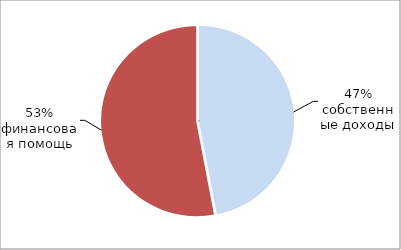
| Category | Series 0 |
|---|---|
| 0 | 0.47 |
| 1 | 0.53 |